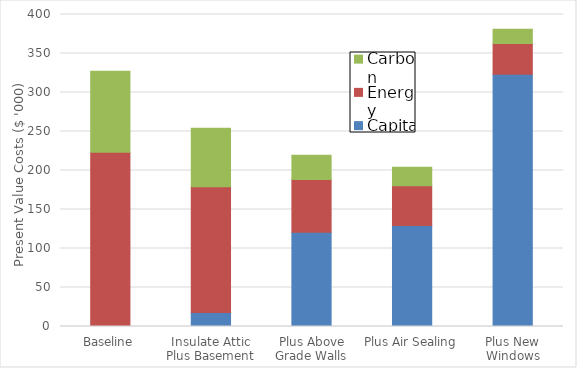
| Category | Capital | Energy | Carbon |
|---|---|---|---|
| Baseline | 0 | 223.435 | 103.804 |
| Insulate Attic Plus Basement | 18.104 | 161.189 | 74.885 |
| Plus Above Grade Walls | 120.91 | 67.434 | 31.329 |
| Plus Air Sealing | 129.531 | 50.912 | 23.653 |
| Plus New Windows | 323.531 | 39.192 | 18.208 |